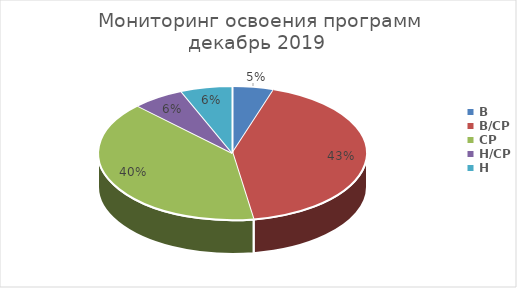
| Category | Series 0 |
|---|---|
| В | 4 |
| В/СР | 34 |
| СР | 32 |
| Н/СР | 5 |
| Н | 5 |